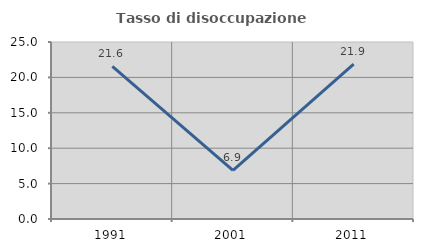
| Category | Tasso di disoccupazione giovanile  |
|---|---|
| 1991.0 | 21.557 |
| 2001.0 | 6.863 |
| 2011.0 | 21.875 |